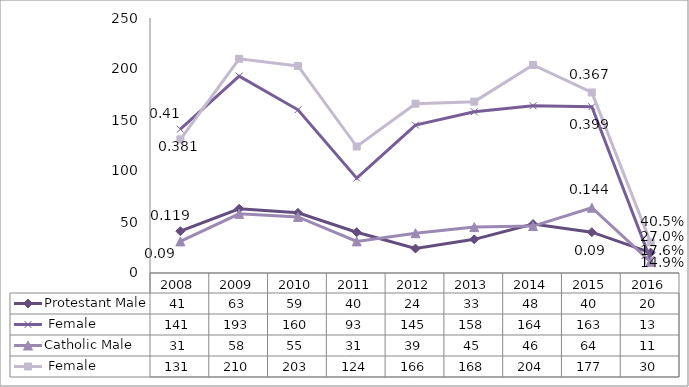
| Category | Protestant | Catholic |
|---|---|---|
| 2008.0 | 141 | 131 |
| 2009.0 | 193 | 210 |
| 2010.0 | 160 | 203 |
| 2011.0 | 93 | 124 |
| 2012.0 | 145 | 166 |
| 2013.0 | 158 | 168 |
| 2014.0 | 164 | 204 |
| 2015.0 | 163 | 177 |
| 2016.0 | 13 | 30 |